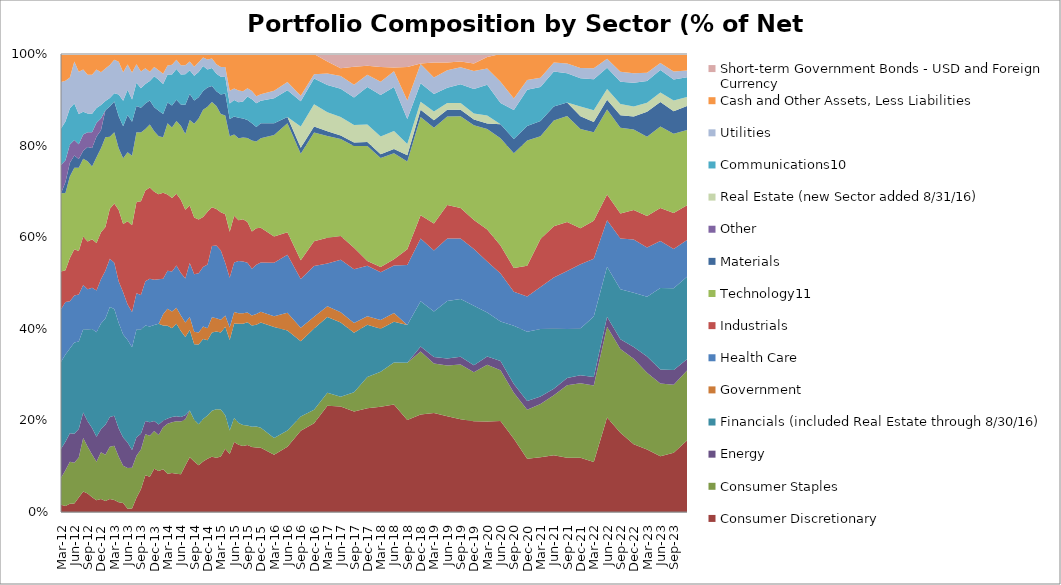
| Category | Consumer Discretionary | Consumer Staples | Energy | Financials (included Real Estate through 8/30/16) | Government | Health Care | Industrials | Technology11 | Materials | Other | Real Estate (new Sector added 8/31/16) | Communications10 | Utilities | Cash and Other Assets, Less Liabilities | Short-term Government Bonds - USD and Foreign Currency |
|---|---|---|---|---|---|---|---|---|---|---|---|---|---|---|---|
| 2012-03-31 | 1.566 | 5.934 | 6.32 | 19.008 | 0 | 11.464 | 8.245 | 17.055 | 0 | 6.188 | 0 | 7.961 | 10.136 | 6.123 | 0 |
| 2012-04-30 | 1.31 | 7.8 | 6.24 | 19.01 | 0 | 11.48 | 6.93 | 16.89 | 2.4 | 4.71 | 0 | 8.47 | 8.9 | 5.84 | 0 |
| 2012-05-31 | 1.81 | 9.16 | 6.25 | 18.49 | 0 | 10.32 | 9.45 | 17.84 | 2.91 | 4.01 | 0 | 7.92 | 6.69 | 5.15 | 0 |
| 2012-06-30 | 1.84 | 8.9 | 6.36 | 19.93 | 0 | 10.23 | 10.09 | 17.82 | 2.68 | 3.39 | 0 | 7.96 | 9.15 | 1.65 | 0 |
| 2012-07-31 | 3.17 | 8.71 | 6.24 | 19.11 | 0 | 10.25 | 9.52 | 18.14 | 1.93 | 3.24 | 0 | 6.59 | 9.21 | 3.89 | 0 |
| 2012-08-31 | 4.47 | 11.7 | 5.56 | 18.18 | 0 | 9.66 | 10.6 | 16.96 | 1.73 | 3.56 | 0 | 4.96 | 9.23 | 3.39 | 0 |
| 2012-09-30 | 4.02 | 10.2 | 5.58 | 20.05 | 0 | 8.79 | 10.41 | 17.52 | 3.13 | 3.24 | 0 | 4.07 | 8.44 | 4.55 | 0 |
| 2012-10-31 | 3.2 | 9.38 | 5.76 | 21.59 | 0 | 9.04 | 10.58 | 15.88 | 4.06 | 3.4 | 0 | 4.07 | 8.53 | 4.51 | 0 |
| 2012-11-30 | 2.55 | 8.42 | 5.47 | 22.79 | 0 | 9.15 | 10.36 | 18.72 | 4.5 | 3.01 | 0 | 3.24 | 8.43 | 3.36 | 0 |
| 2012-12-31 | 2.84 | 10.23 | 5 | 23.09 | 0 | 9.67 | 10.25 | 18.35 | 3.91 | 2.59 | 0 | 2.96 | 7.15 | 3.96 | 0 |
| 2013-01-31 | 2.41 | 10.08 | 6.54 | 23.2 | 0 | 10.42 | 9.55 | 19.63 | 5.87 | 0 | 0 | 2.03 | 7.09 | 3.18 | 0 |
| 2013-02-28 | 2.83 | 11.39 | 6.5 | 24.04 | 0 | 10.55 | 10.92 | 15.71 | 6.57 | 0 | 0 | 1.9 | 7.17 | 2.42 | 0 |
| 2013-03-31 | 2.63 | 11.86 | 6.55 | 23.29 | 0 | 10.08 | 12.97 | 15.55 | 6.68 | 0 | 0 | 1.8 | 7.32 | 1.27 | 0 |
| 2013-04-30 | 2.15 | 9.89 | 6.17 | 23.04 | 0 | 9.09 | 15.6 | 13.46 | 7.01 | 0 | 0 | 4.74 | 7.18 | 1.67 | 0 |
| 2013-05-31 | 1.94 | 8.18 | 6.17 | 22.44 | 0 | 9.25 | 14.91 | 14.34 | 6.98 | 0 | 0 | 5.59 | 6.19 | 4.01 | 0 |
| 2013-06-30 | 0.72 | 8.86 | 5.61 | 22.38 | 0 | 7.76 | 18.16 | 15.08 | 8.11 | 0 | 0 | 5.51 | 5.5 | 2.31 | 0 |
| 2013-07-31 | 0.77 | 8.91 | 3.86 | 22.44 | 0 | 7.7 | 18.94 | 15.16 | 7.41 | 0 | 0 | 4.88 | 5.91 | 4.02 | 0 |
| 2013-08-31 | 3.1 | 9.18 | 4.04 | 23.53 | 0 | 7.91 | 19.91 | 15.27 | 5.68 | 0 | 0 | 5.13 | 4.01 | 2.24 | 0 |
| 2013-09-30 | 4.94 | 8.68 | 3.49 | 22.74 | 0 | 7.55 | 20.43 | 15.02 | 5.43 | 0 | 0 | 4.22 | 3.7 | 3.8 | 0 |
| 2013-10-31 | 8.05 | 8.92 | 2.88 | 20.88 | 0 | 9.62 | 19.84 | 13.41 | 5.56 | 0 | 0 | 4.27 | 3.44 | 3.12 | 0 |
| 2013-11-30 | 7.67 | 8.99 | 2.93 | 20.9 | 0 | 10.44 | 19.94 | 13.75 | 5.25 | 0 | 0 | 4.24 | 2.03 | 3.86 | 0 |
| 2013-12-31 | 9.43 | 8.25 | 2.17 | 20.98 | 0 | 9.87 | 19.21 | 13.21 | 5.28 | 0 | 0 | 6.74 | 2 | 2.86 | 0 |
| 2014-01-31 | 8.97 | 7.84 | 2.27 | 22.02 | 0 | 9.7 | 18.6 | 12.64 | 5.55 | 0 | 0 | 6.78 | 2.1 | 3.53 | 0 |
| 2014-02-28 | 9.35 | 9.17 | 1.41 | 20.79 | 2.45 | 7.76 | 18.77 | 12.12 | 5.08 | 0 | 0 | 6.52 | 2.22 | 4.33 | 0 |
| 2014-03-31 | 8.369 | 10.89 | 1.142 | 20.241 | 3.749 | 8.283 | 16.673 | 15.522 | 4.541 | 0 | 0 | 6.101 | 1.985 | 2.503 | 0 |
| 2014-04-30 | 8.5 | 11.1 | 1.12 | 19.41 | 3.63 | 8.76 | 16.05 | 15.39 | 4.8 | 0 | 0 | 6.77 | 2.12 | 2.35 | 0 |
| 2014-05-31 | 8.37 | 11.45 | 1.07 | 20.2 | 3.52 | 9.2 | 15.69 | 15.89 | 4.64 | 0 | 0 | 6.69 | 2.03 | 1.25 | 0 |
| 2014-06-30 | 8.25 | 11.49 | 1.01 | 18.75 | 3.39 | 9.31 | 15.97 | 16.16 | 4.62 | 0 | 0 | 6.56 | 2.03 | 2.46 | 0 |
| 2014-07-31 | 10.15 | 10.09 | 0.89 | 17.07 | 3.17 | 9.62 | 15 | 16.57 | 6.37 | 0 | 0 | 6.63 | 2 | 2.44 | 0 |
| 2014-08-31 | 11.97 | 10.17 | 0 | 17.62 | 2.84 | 11.76 | 12.55 | 18.69 | 5.64 | 0 | 0 | 5.18 | 1.96 | 1.614 | 0 |
| 2014-09-30 | 11.05 | 9.08 | 0 | 16.52 | 2.7 | 12.56 | 12.37 | 20.51 | 5.05 | 0 | 0 | 5.4 | 1.97 | 2.79 | 0 |
| 2014-10-31 | 10.21 | 8.93 | 0 | 17.42 | 2.63 | 12.93 | 11.77 | 22 | 4.68 | 0 | 0 | 5.49 | 2.12 | 1.82 | 0 |
| 2014-11-30 | 11.01 | 9.29 | 0 | 17.5 | 2.69 | 12.98 | 10.92 | 23.44 | 4.09 | 0 | 0 | 5.46 | 1.86 | 0.76 | 0 |
| 2014-12-31 | 11.6 | 9.45 | 0 | 16.46 | 2.61 | 13.91 | 11.51 | 22.94 | 4.22 | 0 | 0 | 3.89 | 2.21 | 1.2 | 0 |
| 2015-01-31 | 12.04 | 10.09 | 0 | 17.07 | 3.31 | 15.55 | 8.46 | 22.98 | 3.51 | 0 | 0 | 3.93 | 2.08 | 0.98 | 0 |
| 2015-02-28 | 11.84 | 10.58 | 0 | 16.97 | 2.91 | 15.89 | 7.99 | 22.49 | 3.21 | 0 | 0 | 3.79 | 2.08 | 2.25 | 0 |
| 2015-03-31 | 12.13 | 10.23 | 0 | 16.82 | 2.82 | 15.11 | 8.34 | 21.47 | 4.24 | 0 | 0 | 3.9 | 2.09 | 2.85 | 0 |
| 2015-04-30 | 13.82 | 7.28 | 0 | 19.33 | 2.5 | 11.46 | 10.64 | 21.56 | 4.81 | 0 | 0 | 3.56 | 2.2 | 2.84 | 0 |
| 2015-05-31 | 12.67 | 5.14 | 0 | 19.77 | 2.7 | 10.85 | 10.05 | 20.87 | 3.74 | 0 | 0 | 3.39 | 2.77 | 8.05 | 0 |
| 2015-06-30 | 15.29 | 5.24 | 0 | 20.6 | 2.53 | 10.79 | 10.19 | 17.75 | 3.91 | 0 | 0 | 3.59 | 2.51 | 7.54 | 0 |
| 2015-07-31 | 14.71 | 4.71 | 0 | 21.66 | 2.32 | 11.38 | 8.9 | 17.9 | 4.49 | 0 | 0 | 3.39 | 2.56 | 7.98 | 0 |
| 2015-08-31 | 14.42 | 4.58 | 0 | 22.08 | 2.3 | 11.3 | 9.22 | 17.87 | 4.16 | 0 | 0 | 3.69 | 2.26 | 8.12 | 0 |
| 2015-09-30 | 14.63 | 4.27 | 0 | 22.53 | 2.15 | 10.82 | 8.93 | 18.31 | 3.95 | 0 | 0 | 5.14 | 1.77 | 7.5 | 0 |
| 2015-10-31 | 14.19 | 4.45 | 0 | 22.09 | 2.17 | 10.19 | 8.13 | 19.92 | 3.74 | 0 | 0 | 5.25 | 1.79 | 8.08 | 0 |
| 2015-11-30 | 14.09 | 4.59 | 0 | 22.23 | 2.32 | 10.76 | 7.97 | 18.93 | 3.15 | 0 | 0 | 5.21 | 1.51 | 9.24 | 0 |
| 2015-12-31 | 14.04 | 4.34 | 0 | 22.97 | 2.38 | 10.76 | 7.6 | 19.54 | 3.26 | 0 | 0 | 4.92 | 1.38 | 8.81 | 0 |
| 2016-03-31 | 12.5 | 3.68 | 0 | 24.22 | 2.32 | 11.69 | 5.74 | 22.15 | 2.57 | 0 | 0 | 5.47 | 1.62 | 8.04 | 0 |
| 2016-06-30 | 14.22 | 3.6 | 0 | 21.79 | 3.91 | 12.64 | 4.93 | 23.79 | 1.36 | 0 | 0 | 5.83 | 1.84 | 6.09 | 0 |
| 2016-09-30 | 17.72 | 3.11 | 0 | 16.44 | 2.94 | 10.69 | 4.07 | 23.25 | 1.29 | 0 | 4.66 | 5.5 | 1.22 | 9.11 | 0 |
| 2016-12-31 | 19.37 | 2.93 | 0 | 17.77 | 2.57 | 11.09 | 5.36 | 23.78 | 1.28 | 0 | 4.9 | 5.61 | 0.91 | 4.43 | 0 |
| 2017-03-31 | 23.22 | 2.83 | 0 | 16.55 | 2.34 | 9.33 | 5.59 | 22.26 | 1.03 | 0 | 4.13 | 5.94 | 2.53 | 2.59 | 1.66 |
| 2017-06-30 | 23.03 | 2.11 | 0 | 16.26 | 2.2 | 11.46 | 5.19 | 21.19 | 0.77 | 0 | 4.05 | 6.14 | 2.79 | 1.72 | 3.09 |
| 2017-09-30 | 21.96 | 4.2 | 0 | 13 | 2.13 | 11.69 | 4.71 | 22.2 | 0.76 | 0 | 3.83 | 6.04 | 2.74 | 3.93 | 2.81 |
| 2017-12-31 | 22.65 | 6.82 | 0 | 11.4 | 1.87 | 11.03 | 1.02 | 25.13 | 0.86 | 0 | 3.83 | 8.16 | 2.68 | 2.01 | 2.54 |
| 2018-03-31 | 22.99 | 7.62 | 0 | 9.42 | 1.87 | 10.45 | 1.13 | 23.83 | 0.81 | 0 | 3.87 | 9.05 | 2.88 | 3.26 | 2.82 |
| 2018-06-30 | 23.45 | 9.17 | 0 | 8.93 | 1.91 | 10.36 | 1.35 | 23.15 | 0.96 | 0 | 3.93 | 9.58 | 3.45 | 0.83 | 2.93 |
| 2018-09-30 | 20.08 | 12.5 | 0 | 8.26 | 0 | 13.07 | 3.48 | 19.15 | 1.37 | 0 | 2.42 | 5.48 | 4.04 | 7.29 | 2.86 |
| 2018-12-31 | 21.27 | 13.79 | 1.08 | 9.86 | 0 | 13.71 | 5.09 | 21.45 | 1.6 | 0 | 1.74 | 4.02 | 4.2 | 0.12 | 2.07 |
| 2019-03-31 | 21.59 | 10.81 | 1.42 | 9.98 | 0 | 13.32 | 5.87 | 20.91 | 1.63 | 0 | 1.92 | 3.79 | 3.64 | 3.24 | 1.88 |
| 2019-06-30 | 20.93 | 11.06 | 1.54 | 12.53 | 0 | 13.65 | 7.34 | 19.3 | 1.49 | 0 | 1.48 | 3.31 | 3.82 | 1.71 | 1.84 |
| 2019-09-30 | 20.25 | 11.98 | 1.67 | 12.62 | 0 | 13.18 | 6.69 | 20.03 | 1.4 | 0 | 1.46 | 4.12 | 3.72 | 1.24 | 1.64 |
| 2019-12-31 | 19.8 | 10.71 | 1.54 | 12.96 | 0 | 12.39 | 6.36 | 20.67 | 1.28 | 0 | 1.32 | 5.31 | 3.97 | 1.62 | 2.07 |
| 2020-03-31 | 19.75 | 12.38 | 1.84 | 9.59 | 0 | 11.11 | 7 | 21.96 | 1.22 | 0 | 1.71 | 6.74 | 3.54 | 2.52 | 0.64 |
| 2020-06-30 | 19.85 | 11.1 | 2.03 | 8.59 | 0 | 10.49 | 6.14 | 23.41 | 3.03 | 0 | 0 | 4.64 | 4.65 | 6.07 | 0 |
| 2020-09-30 | 15.99 | 10.03 | 1.92 | 12.7 | 0 | 7.43 | 5.23 | 25.04 | 3.11 | 0 | 0 | 6.34 | 2.48 | 9.73 | 0 |
| 2020-12-31 | 11.62 | 10.72 | 1.87 | 15.16 | 0 | 7.69 | 6.73 | 27.3 | 3.17 | 0 | 0 | 7.92 | 2.12 | 5.7 | 0 |
| 2021-03-31 | 11.97 | 11.63 | 1.64 | 14.71 | 0 | 9.17 | 10.46 | 22.48 | 3.32 | 0 | 0 | 7.42 | 1.99 | 5.21 | 0 |
| 2021-06-30 | 12.39 | 13.08 | 1.45 | 13.17 | 0 | 11.1 | 11.18 | 23.11 | 3.08 | 0 | 0 | 7.64 | 1.94 | 1.86 | 0 |
| 2021-09-30 | 11.84 | 15.83 | 1.58 | 10.72 | 0 | 12.63 | 10.7 | 23.19 | 2.94 | 0 | 0 | 6.37 | 2.15 | 2.05 | 0 |
| 2021-12-31 | 11.85 | 16.26 | 1.75 | 10.23 | 0 | 14.01 | 7.88 | 21.66 | 2.77 | 0 | 2.1 | 6.21 | 2.22 | 3.06 | 0 |
| 2022-03-31 | 10.9 | 16.7 | 1.89 | 13.21 | 0 | 12.57 | 8.3 | 19.36 | 2.25 | 0 | 2.56 | 6.77 | 2.38 | 3.11 | 0 |
| 2022-06-30 | 20.65 | 19.79 | 2.17 | 10.96 | 0 | 10.12 | 5.65 | 18.54 | 2.12 | 0 | 2.38 | 4.62 | 1.96 | 1.04 | 0 |
| 2022-09-30 | 17.33 | 18.25 | 2.15 | 10.93 | 0 | 11.03 | 5.5 | 18.72 | 2.72 | 0 | 2.43 | 4.88 | 2.19 | 3.87 | 0 |
| 2022-12-31 | 14.81 | 18.63 | 2.58 | 11.84 | 0 | 11.66 | 6.43 | 17.57 | 2.82 | 0 | 2.21 | 5.19 | 2.05 | 4.21 | 0 |
| 2023-03-31 | 13.63 | 16.78 | 3.53 | 13.05 | 0 | 10.77 | 6.89 | 17.29 | 5.43 | 0 | 1.99 | 4.75 | 1.81 | 4.08 | 0 |
| 2023-06-30 | 12.16 | 15.91 | 3.06 | 17.8 | 0 | 10.26 | 7.17 | 17.8 | 5.36 | 0 | 2.07 | 4.92 | 1.55 | 1.94 | 0 |
| 2023-09-30 | 12.96 | 14.82 | 3.24 | 17.82 | 0 | 8.6 | 7.86 | 17.3 | 4.92 | 0 | 2.33 | 4.56 | 1.78 | 3.81 | 0 |
| 2023-12-31 | 15.6 | 15.3 | 2.47 | 18.01 | 0 | 8 | 7.6 | 16.4 | 5.24 | 0 | 1.97 | 4.36 | 1.47 | 3.58 | 0 |